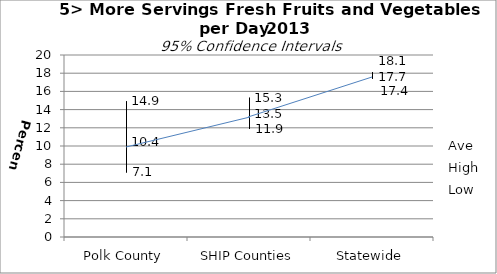
| Category | Ave | High | Low |
|---|---|---|---|
| Polk County | 10.4 | 14.9 | 7.1 |
| SHIP Counties | 13.5 | 15.3 | 11.9 |
| Statewide | 17.7 | 18.1 | 17.4 |